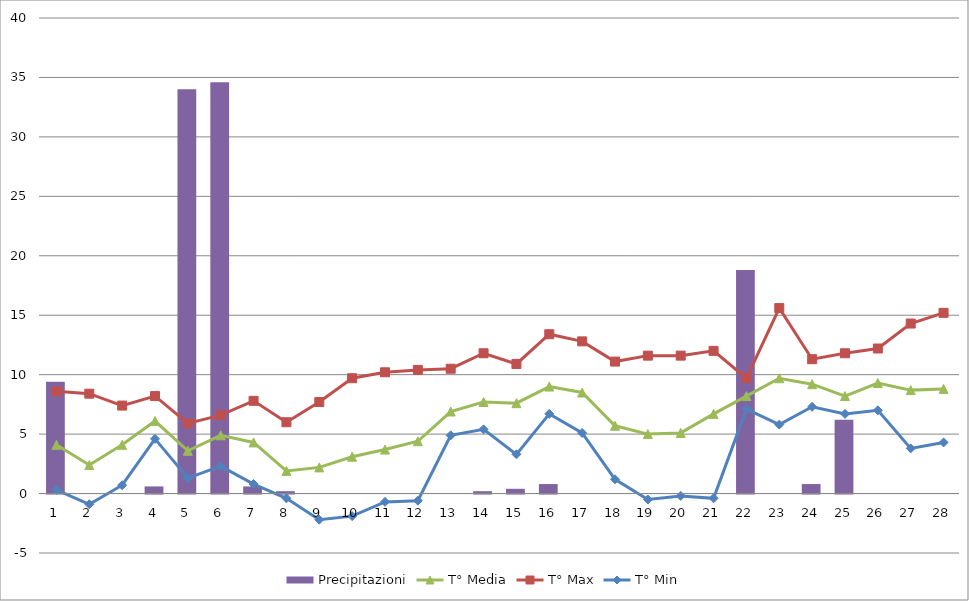
| Category | Precipitazioni |
|---|---|
| 0 | 9.4 |
| 1 | 0 |
| 2 | 0 |
| 3 | 0.6 |
| 4 | 34 |
| 5 | 34.6 |
| 6 | 0.6 |
| 7 | 0.2 |
| 8 | 0 |
| 9 | 0 |
| 10 | 0 |
| 11 | 0 |
| 12 | 0 |
| 13 | 0.2 |
| 14 | 0.4 |
| 15 | 0.8 |
| 16 | 0 |
| 17 | 0 |
| 18 | 0 |
| 19 | 0 |
| 20 | 0 |
| 21 | 18.8 |
| 22 | 0 |
| 23 | 0.8 |
| 24 | 6.2 |
| 25 | 0 |
| 26 | 0 |
| 27 | 0 |